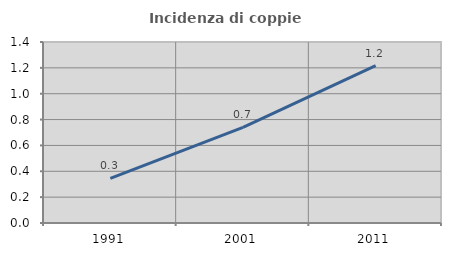
| Category | Incidenza di coppie miste |
|---|---|
| 1991.0 | 0.346 |
| 2001.0 | 0.74 |
| 2011.0 | 1.218 |